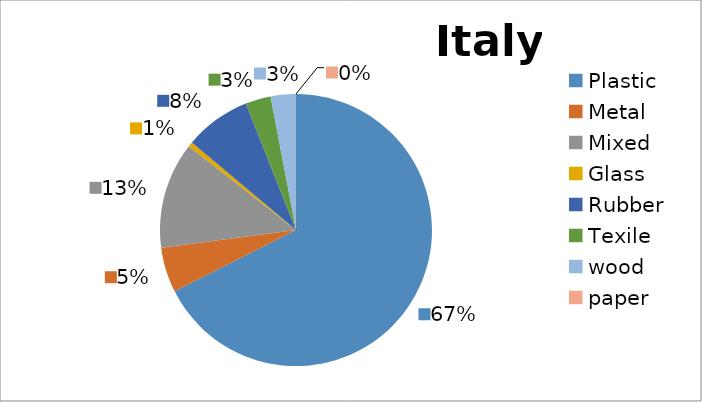
| Category | Italy |
|---|---|
| Plastic | 1474.46 |
| Metal | 117.317 |
| Mixed | 275.69 |
| Glass | 12.33 |
| Rubber | 171.713 |
| Texile | 65.998 |
| wood | 65.24 |
| paper | 0.07 |